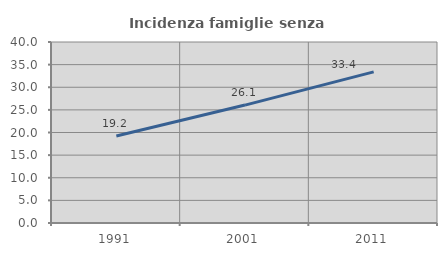
| Category | Incidenza famiglie senza nuclei |
|---|---|
| 1991.0 | 19.236 |
| 2001.0 | 26.06 |
| 2011.0 | 33.388 |